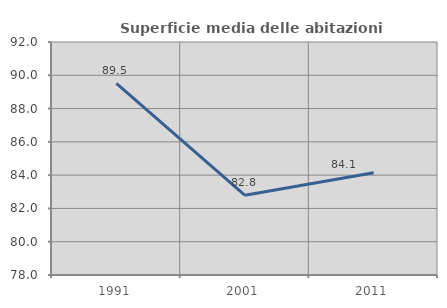
| Category | Superficie media delle abitazioni occupate |
|---|---|
| 1991.0 | 89.52 |
| 2001.0 | 82.788 |
| 2011.0 | 84.146 |